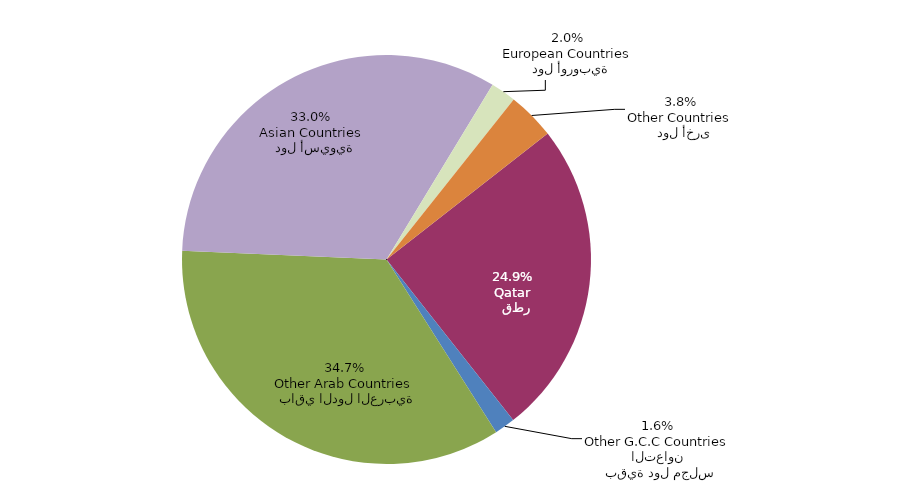
| Category | Series 0 |
|---|---|
|   قطر
Qatar | 1366 |
|   بقية دول مجلس التعاون
Other G.C.C Countries | 89 |
|   باقي الدول العربية
Other Arab Countries | 1901 |
|   دول أسيوية
Asian Countries | 1808 |
|   دول أوروبية
European Countries | 110 |
|   دول أخرى
Other Countries | 206 |